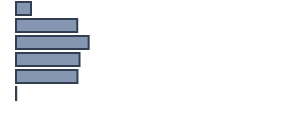
| Category | Series 0 |
|---|---|
| 0 | 5.455 |
| 1 | 22.348 |
| 2 | 26.515 |
| 3 | 23.182 |
| 4 | 22.424 |
| 5 | 0.076 |
| 6 | 0 |